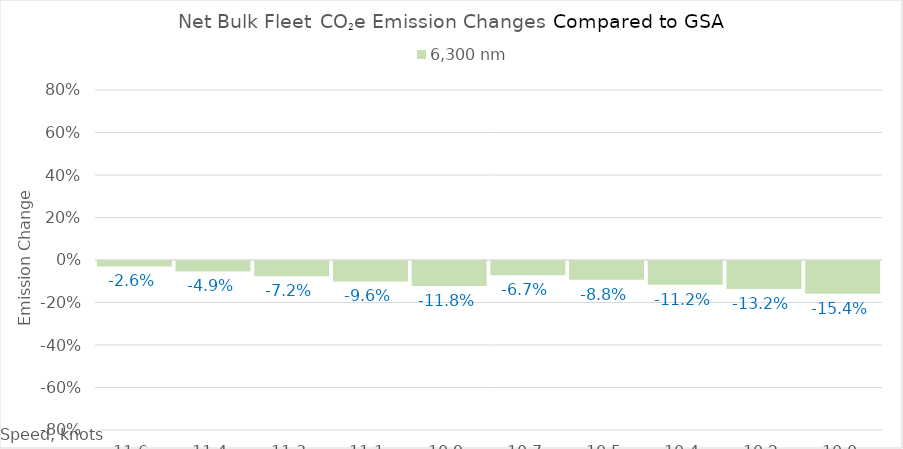
| Category | 6,300 |
|---|---|
| 11.620000000000001 | -0.026 |
| 11.440000000000001 | -0.049 |
| 11.260000000000002 | -0.072 |
| 11.080000000000002 | -0.096 |
| 10.900000000000002 | -0.118 |
| 10.720000000000002 | -0.067 |
| 10.540000000000003 | -0.088 |
| 10.360000000000003 | -0.112 |
| 10.180000000000003 | -0.132 |
| 10.000000000000004 | -0.154 |